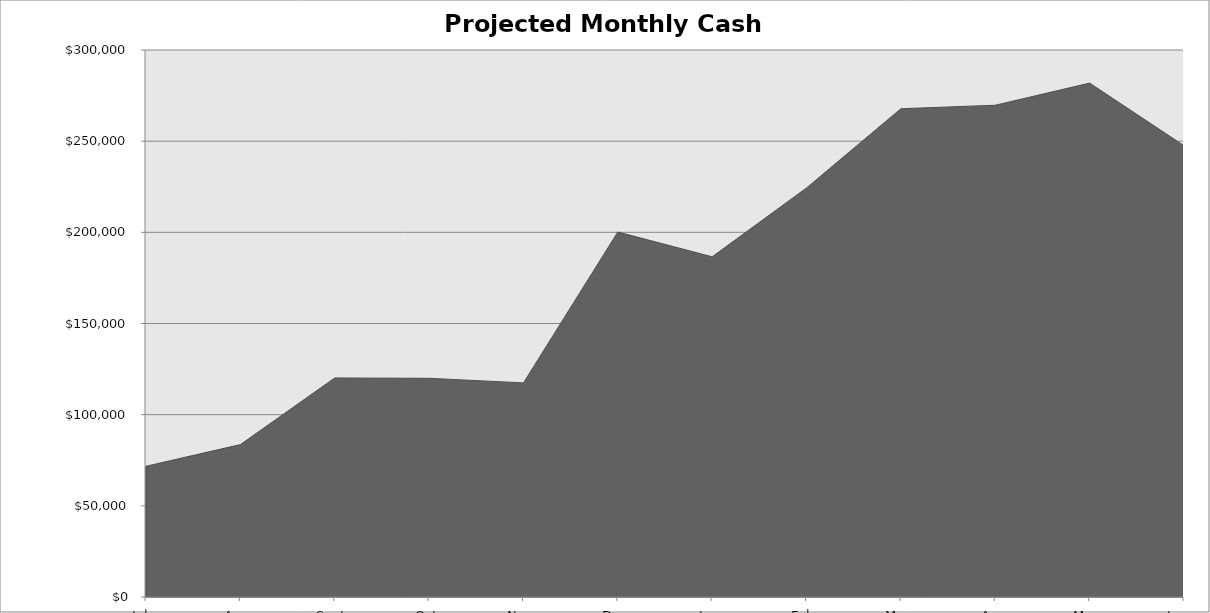
| Category | Projected Monthly Cash Balance |
|---|---|
| July | 71717.082 |
| Aug | 83577.123 |
| Sept | 120125.012 |
| Oct | 119946.421 |
| Nov | 117435.387 |
| Dec | 200167.151 |
| Jan | 186579.259 |
| Feb | 224334.63 |
| Mar | 267798.178 |
| Apr | 269699.431 |
| May | 281841.18 |
| June | 247530.652 |